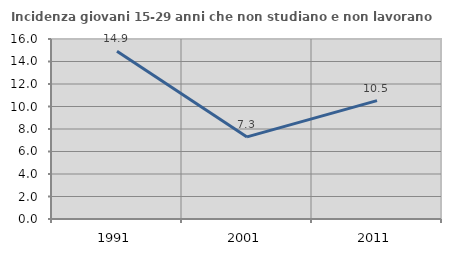
| Category | Incidenza giovani 15-29 anni che non studiano e non lavorano  |
|---|---|
| 1991.0 | 14.906 |
| 2001.0 | 7.297 |
| 2011.0 | 10.519 |